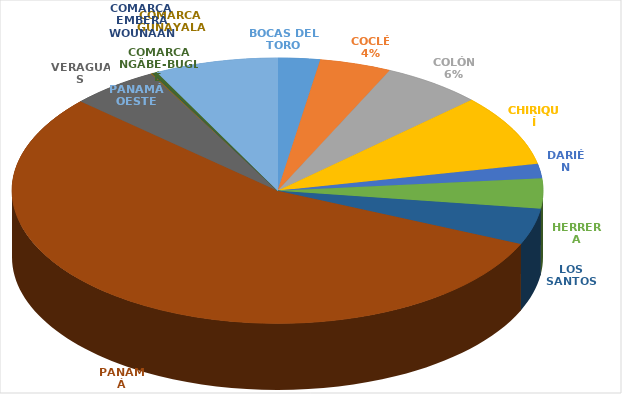
| Category | Cantidad  |
|---|---|
| BOCAS DEL TORO | 148 |
| COCLÉ | 251 |
| COLÓN | 350 |
| CHIRIQUÍ | 504 |
| DARIÉN | 100 |
| HERRERA | 211 |
| LOS SANTOS | 254 |
| PANAMÁ | 3174 |
| VERAGUAS | 311 |
| COMARCA GUNAYALA | 5 |
| COMARCA EMBERÁ WOUNAAN | 1 |
| COMARCA NGÄBE-BUGLÉ | 16 |
| PANAMÁ OESTE | 432 |